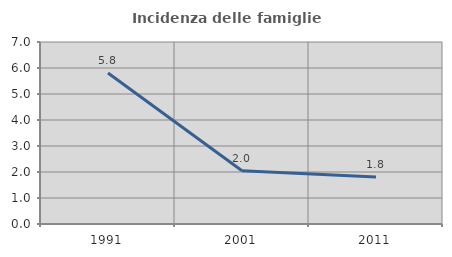
| Category | Incidenza delle famiglie numerose |
|---|---|
| 1991.0 | 5.805 |
| 2001.0 | 2.046 |
| 2011.0 | 1.809 |